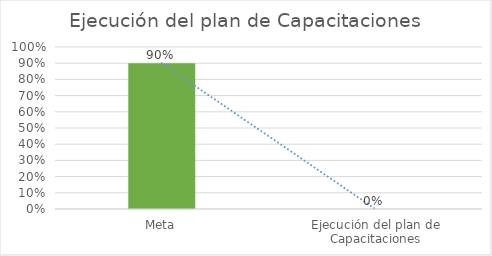
| Category | Series 0 |
|---|---|
| Meta | 0.9 |
| Ejecución del plan de Capacitaciones | 0 |